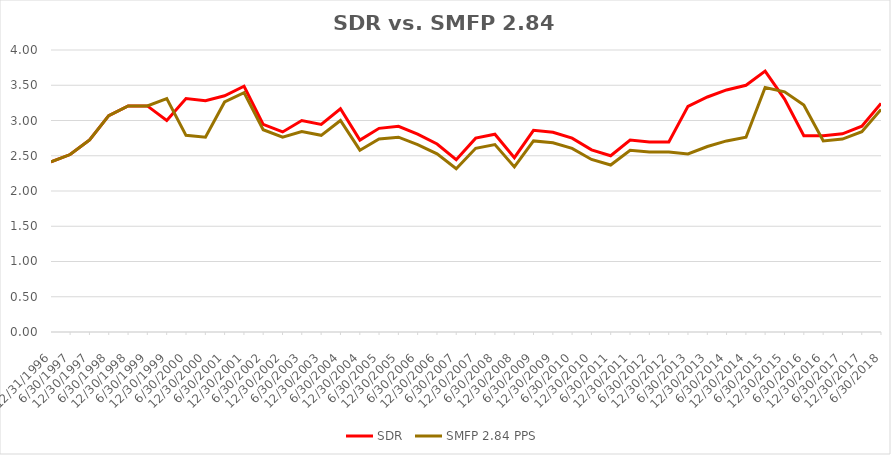
| Category | SDR | SMFP 2.84 PPS |
|---|---|---|
| 12/31/96 | 2.414 | 2.414 |
| 6/30/97 | 2.517 | 2.517 |
| 12/31/97 | 2.724 | 2.724 |
| 6/30/98 | 3.069 | 3.069 |
| 12/31/98 | 3.207 | 3.207 |
| 6/30/99 | 3.207 | 3.207 |
| 12/31/99 | 3 | 3.31 |
| 6/30/00 | 3.312 | 2.789 |
| 12/31/00 | 3.281 | 2.763 |
| 6/30/01 | 3.351 | 3.263 |
| 12/31/01 | 3.486 | 3.395 |
| 6/30/02 | 2.946 | 2.868 |
| 12/31/02 | 2.838 | 2.763 |
| 6/30/03 | 3 | 2.842 |
| 12/31/03 | 2.944 | 2.789 |
| 6/30/04 | 3.167 | 3 |
| 12/31/04 | 2.722 | 2.579 |
| 6/30/05 | 2.889 | 2.737 |
| 12/31/05 | 2.917 | 2.763 |
| 6/30/06 | 2.806 | 2.658 |
| 12/31/06 | 2.667 | 2.526 |
| 6/30/07 | 2.444 | 2.316 |
| 12/31/07 | 2.75 | 2.605 |
| 6/30/08 | 2.806 | 2.658 |
| 12/31/08 | 2.472 | 2.342 |
| 6/30/09 | 2.861 | 2.711 |
| 12/31/09 | 2.833 | 2.684 |
| 6/30/10 | 2.75 | 2.605 |
| 12/31/10 | 2.583 | 2.447 |
| 6/30/11 | 2.5 | 2.368 |
| 12/31/11 | 2.722 | 2.579 |
| 6/30/12 | 2.694 | 2.553 |
| 12/31/12 | 2.694 | 2.553 |
| 6/30/13 | 3.2 | 2.526 |
| 12/31/13 | 3.333 | 2.632 |
| 6/30/14 | 3.433 | 2.711 |
| 12/31/14 | 3.5 | 2.763 |
| 6/30/15 | 3.7 | 3.469 |
| 12/31/15 | 3.303 | 3.406 |
| 6/30/16 | 2.784 | 3.219 |
| 12/31/16 | 2.784 | 2.711 |
| 6/30/17 | 2.811 | 2.737 |
| 12/31/17 | 2.919 | 2.842 |
| 6/30/18 | 3.243 | 3.158 |